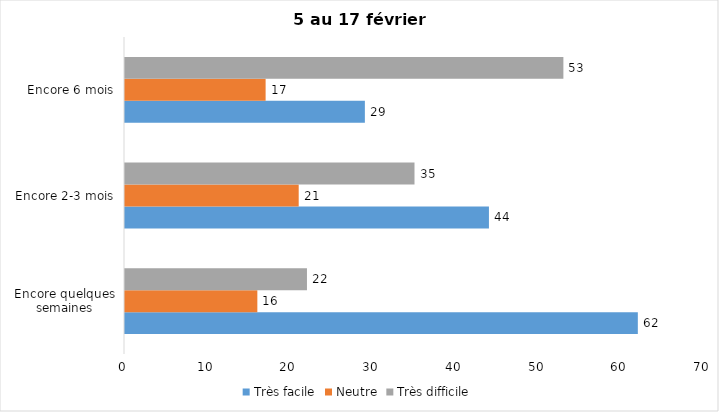
| Category | Très facile | Neutre | Très difficile |
|---|---|---|---|
| Encore quelques semaines | 62 | 16 | 22 |
| Encore 2-3 mois | 44 | 21 | 35 |
| Encore 6 mois | 29 | 17 | 53 |